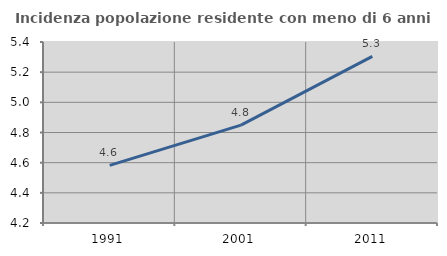
| Category | Incidenza popolazione residente con meno di 6 anni |
|---|---|
| 1991.0 | 4.582 |
| 2001.0 | 4.849 |
| 2011.0 | 5.305 |